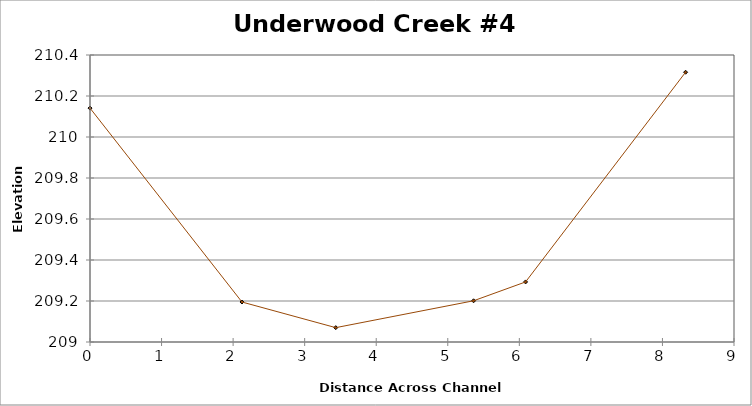
| Category | Series 0 |
|---|---|
| 0.0 | 210.141 |
| 2.1238053112944826 | 209.195 |
| 3.4345865836420737 | 209.07 |
| 5.3601978507883965 | 209.201 |
| 6.0871560682884684 | 209.293 |
| 8.323446401571234 | 210.316 |